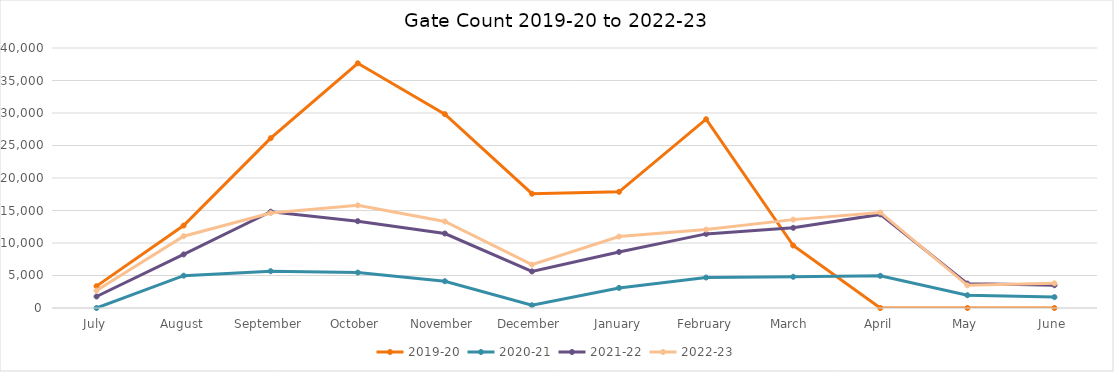
| Category | 2019-20 | 2020-21 | 2021-22 | 2022-23 |
|---|---|---|---|---|
| July | 3363 | 0 | 1767 | 2685 |
| August | 12682 | 4973 | 8242 | 11045 |
| September | 26129 | 5666 | 14811 | 14601 |
| October | 37649 | 5454 | 13359 | 15794 |
| November | 29822 | 4123 | 11459 | 13311 |
| December | 17581 | 424 | 5626 | 6663 |
| January | 17872 | 3091 | 8621 | 10989 |
| February | 29043 | 4692 | 11403 | 12067 |
| March  | 9611 | 4801 | 12332 | 13596 |
| April | 0 | 4952 | 14393 | 14700 |
| May | 0 | 1964 | 3761 | 3488 |
| June | 0 | 1676 | 3504 | 3792 |